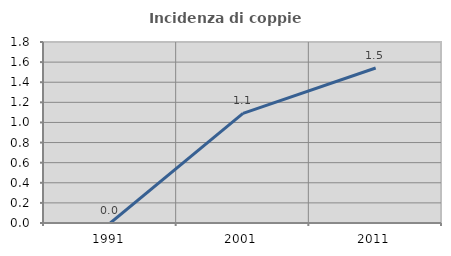
| Category | Incidenza di coppie miste |
|---|---|
| 1991.0 | 0 |
| 2001.0 | 1.091 |
| 2011.0 | 1.541 |